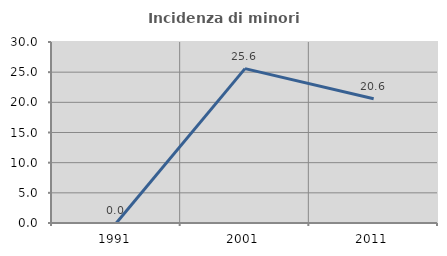
| Category | Incidenza di minori stranieri |
|---|---|
| 1991.0 | 0 |
| 2001.0 | 25.581 |
| 2011.0 | 20.606 |